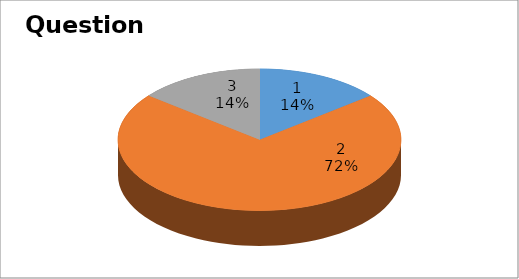
| Category | Series 0 |
|---|---|
| 0 | 2 |
| 1 | 10 |
| 2 | 2 |